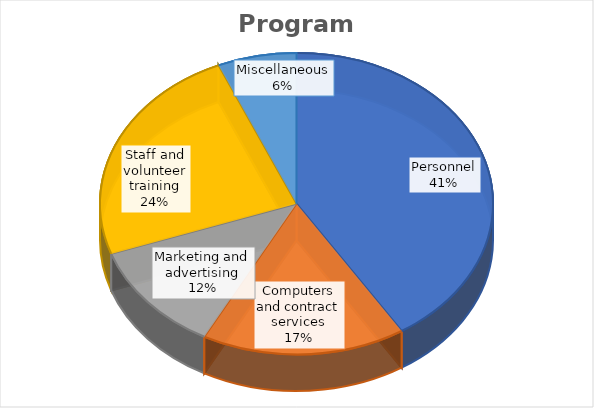
| Category | Series 0 |
|---|---|
| Personnel | 57384 |
| Computers and contract services | 23435 |
| Marketing and advertising | 16543 |
| Staff and volunteer training | 33454 |
| Miscellaneous | 9084 |